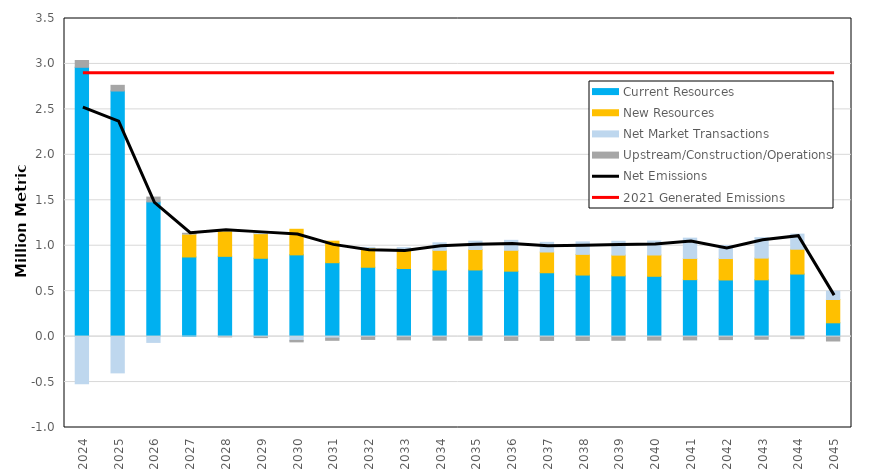
| Category | Current Resources | New Resources | Net Market Transactions | Upstream/Construction/Operations |
|---|---|---|---|---|
| 2024.0 | 2.963 | 0 | -0.519 | 0.075 |
| 2025.0 | 2.702 | 0 | -0.399 | 0.063 |
| 2026.0 | 1.482 | 0 | -0.064 | 0.053 |
| 2027.0 | 0.876 | 0.253 | 0.002 | 0.006 |
| 2028.0 | 0.883 | 0.28 | 0.011 | -0.003 |
| 2029.0 | 0.862 | 0.271 | 0.025 | -0.011 |
| 2030.0 | 0.899 | 0.282 | -0.042 | -0.016 |
| 2031.0 | 0.813 | 0.237 | -0.016 | -0.024 |
| 2032.0 | 0.763 | 0.212 | 0.006 | -0.031 |
| 2033.0 | 0.749 | 0.215 | 0.015 | -0.035 |
| 2034.0 | 0.732 | 0.217 | 0.083 | -0.039 |
| 2035.0 | 0.733 | 0.225 | 0.092 | -0.041 |
| 2036.0 | 0.72 | 0.23 | 0.109 | -0.042 |
| 2037.0 | 0.703 | 0.228 | 0.106 | -0.042 |
| 2038.0 | 0.677 | 0.228 | 0.137 | -0.042 |
| 2039.0 | 0.669 | 0.228 | 0.152 | -0.04 |
| 2040.0 | 0.664 | 0.234 | 0.154 | -0.039 |
| 2041.0 | 0.627 | 0.234 | 0.223 | -0.036 |
| 2042.0 | 0.623 | 0.235 | 0.143 | -0.033 |
| 2043.0 | 0.625 | 0.239 | 0.225 | -0.029 |
| 2044.0 | 0.688 | 0.273 | 0.166 | -0.023 |
| 2045.0 | 0.152 | 0.256 | 0.091 | -0.048 |